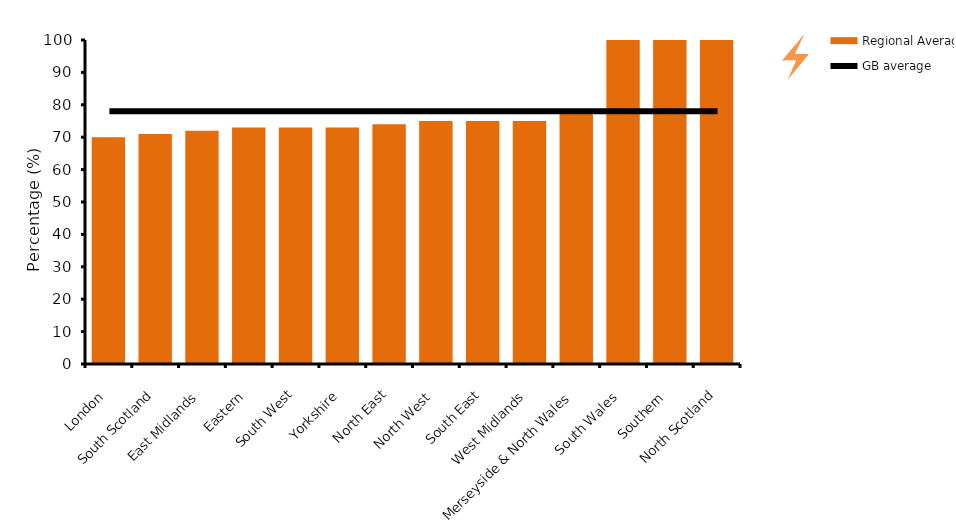
| Category | Regional Average |
|---|---|
| London | 70 |
| South Scotland | 71 |
| East Midlands | 72 |
| Eastern | 73 |
| South West | 73 |
| Yorkshire | 73 |
| North East | 74 |
| North West | 75 |
| South East | 75 |
| West Midlands | 75 |
| Merseyside & North Wales | 78 |
| South Wales | 100 |
| Southern | 100 |
| North Scotland | 100 |